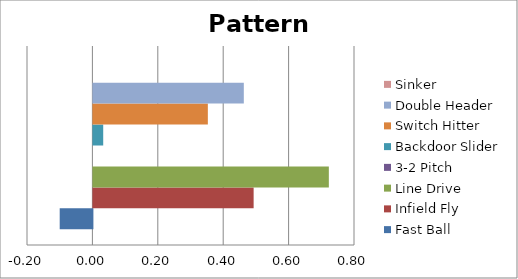
| Category | Fast Ball | Infield Fly | Line Drive | 3-2 Pitch | Backdoor Slider | Switch Hitter | Double Header | Sinker |
|---|---|---|---|---|---|---|---|---|
| 0 | -0.1 | 0.49 | 0.72 | 0 | 0.03 | 0.35 | 0.46 | 0 |